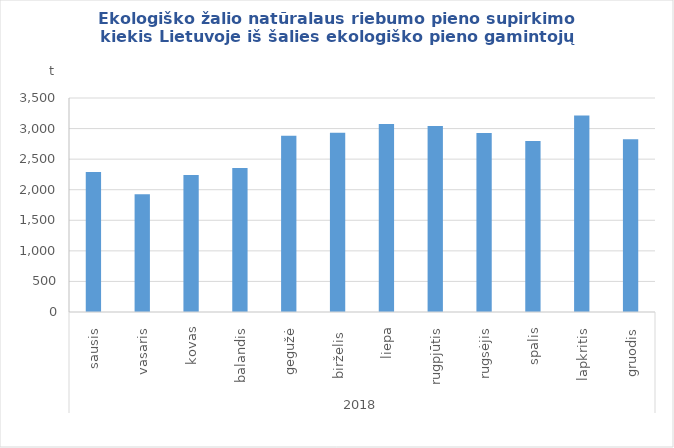
| Category | Ekologiško žalio natūralaus riebumo pieno supirkimo kiekis Lietuvoje iš šalies ekologiško pieno gamintojų |
|---|---|
| 0 | 2289.96 |
| 1 | 1924.79 |
| 2 | 2239.04 |
| 3 | 2355.85 |
| 4 | 2880.68 |
| 5 | 2932.94 |
| 6 | 3072.75 |
| 7 | 3043.77 |
| 8 | 2927.63 |
| 9 | 2797.26 |
| 10 | 3213.87 |
| 11 | 2826.94 |